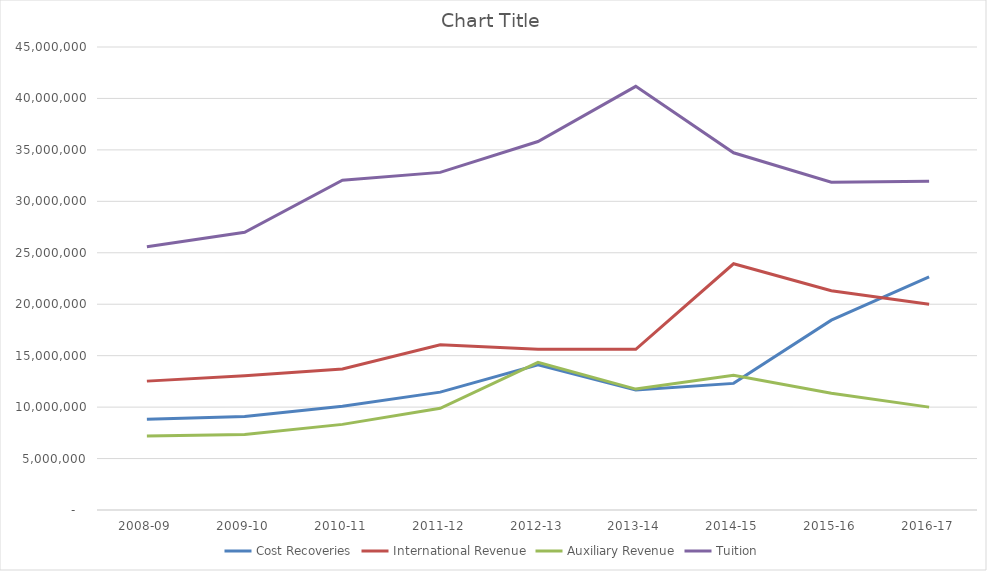
| Category | Cost Recoveries | International Revenue | Auxiliary Revenue | Tuition |
|---|---|---|---|---|
| 2008-09 | 8829910 | 12525517 | 7189336 | 25586735 |
| 2009-10 | 9093437 | 13049177 | 7333122.72 | 26984901 |
| 2010-11 | 10082716 | 13705866.31 | 8321138.41 | 32044273 |
| 2011-12 | 11456624 | 16055745.46 | 9882540.81 | 32813127 |
| 2012-13 | 14115565 | 15619442 | 14353369 | 35813578 |
| 2013-14 | 11653905 | 15616990 | 11752089 | 41175983 |
| 2014-15 | 12306263 | 23931439 | 13105598 | 34717734 |
| 2015-16 | 18447638 | 21310789 | 11346387 | 31854703 |
| 2016-17 | 22657411 | 20000000 | 10000000 | 31956243 |